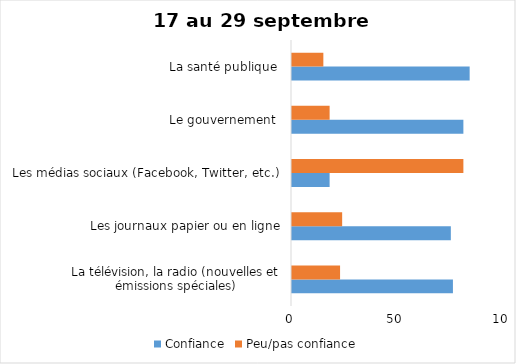
| Category | Confiance | Peu/pas confiance |
|---|---|---|
| La télévision, la radio (nouvelles et émissions spéciales) | 77 | 23 |
| Les journaux papier ou en ligne | 76 | 24 |
| Les médias sociaux (Facebook, Twitter, etc.) | 18 | 82 |
| Le gouvernement  | 82 | 18 |
| La santé publique  | 85 | 15 |